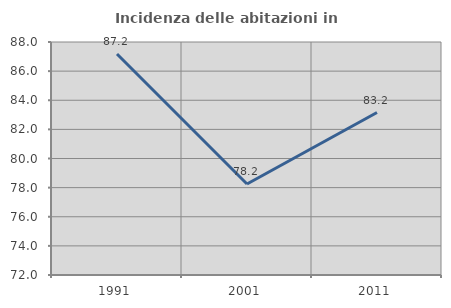
| Category | Incidenza delle abitazioni in proprietà  |
|---|---|
| 1991.0 | 87.179 |
| 2001.0 | 78.249 |
| 2011.0 | 83.158 |